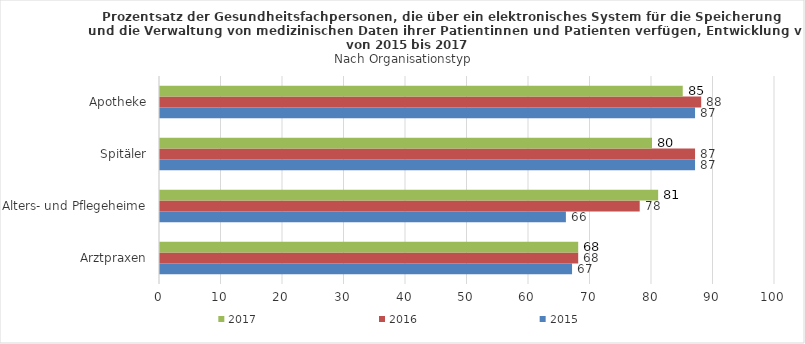
| Category | 2015 | 2016 | 2017 |
|---|---|---|---|
| Arztpraxen | 67 | 68 | 68 |
| Alters- und Pflegeheime | 66 | 78 | 81 |
| Spitäler | 87 | 87 | 80 |
| Apotheke | 87 | 88 | 85 |